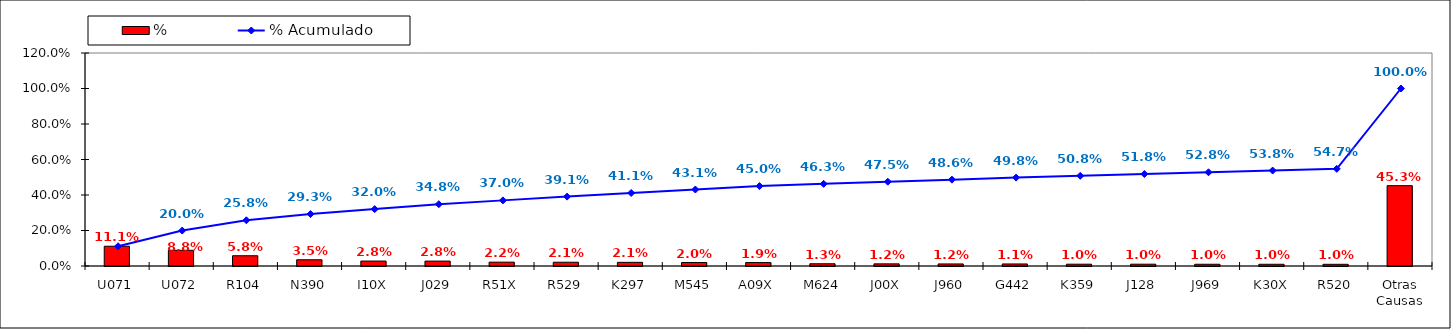
| Category | % |
|---|---|
| U071 | 0.111 |
| U072 | 0.088 |
| R104 | 0.058 |
| N390 | 0.035 |
| I10X | 0.028 |
| J029 | 0.028 |
| R51X | 0.022 |
| R529 | 0.021 |
| K297 | 0.021 |
| M545 | 0.02 |
| A09X | 0.019 |
| M624 | 0.013 |
| J00X | 0.012 |
| J960 | 0.012 |
| G442 | 0.011 |
| K359 | 0.01 |
| J128 | 0.01 |
| J969 | 0.01 |
| K30X | 0.01 |
| R520 | 0.01 |
| Otras Causas | 0.453 |